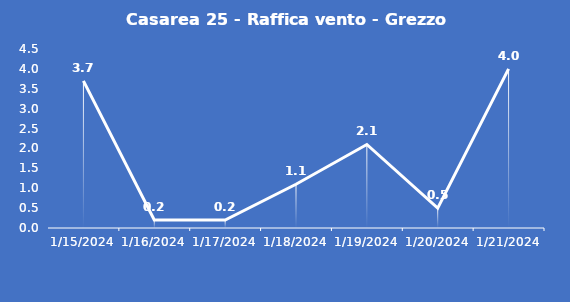
| Category | Casarea 25 - Raffica vento - Grezzo (m/s) |
|---|---|
| 1/15/24 | 3.7 |
| 1/16/24 | 0.2 |
| 1/17/24 | 0.2 |
| 1/18/24 | 1.1 |
| 1/19/24 | 2.1 |
| 1/20/24 | 0.5 |
| 1/21/24 | 4 |